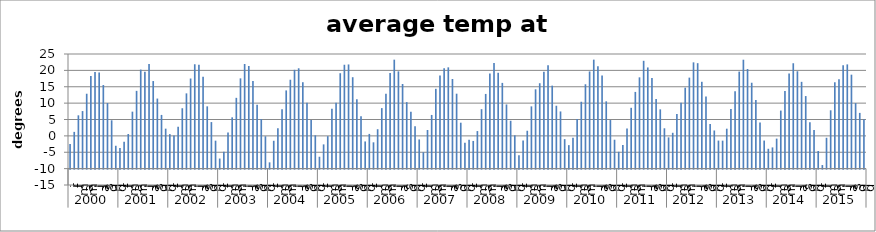
| Category | avg T |
|---|---|
| 0 | -2.5 |
| 1 | 1.222 |
| 2 | 6.278 |
| 3 | 7.576 |
| 4 | 12.867 |
| 5 | 18.313 |
| 6 | 19.541 |
| 7 | 19.361 |
| 8 | 15.525 |
| 9 | 10.04 |
| 10 | 4.756 |
| 11 | -3.018 |
| 12 | -3.688 |
| 13 | -1.783 |
| 14 | 0.572 |
| 15 | 7.396 |
| 16 | 13.746 |
| 17 | 20.231 |
| 18 | 19.61 |
| 19 | 21.93 |
| 20 | 16.744 |
| 21 | 11.394 |
| 22 | 6.401 |
| 23 | 2.203 |
| 24 | 0.542 |
| 25 | 0.091 |
| 26 | 2.758 |
| 27 | 8.437 |
| 28 | 12.981 |
| 29 | 17.514 |
| 30 | 21.87 |
| 31 | 21.748 |
| 32 | 18.038 |
| 33 | 9.015 |
| 34 | 4.213 |
| 35 | -1.461 |
| 36 | -6.916 |
| 37 | -4.881 |
| 38 | 1.021 |
| 39 | 5.662 |
| 40 | 11.616 |
| 41 | 17.56 |
| 42 | 21.952 |
| 43 | 21.338 |
| 44 | 16.763 |
| 45 | 9.521 |
| 46 | 5.112 |
| 47 | -0.12 |
| 48 | -8.086 |
| 49 | -1.494 |
| 50 | 2.306 |
| 51 | 8.167 |
| 52 | 13.882 |
| 53 | 17.143 |
| 54 | 20.169 |
| 55 | 20.641 |
| 56 | 16.384 |
| 57 | 10.078 |
| 58 | 4.861 |
| 59 | 0.165 |
| 60 | -6.374 |
| 61 | -2.598 |
| 62 | -0.086 |
| 63 | 8.309 |
| 64 | 10.122 |
| 65 | 19.134 |
| 66 | 21.721 |
| 67 | 21.81 |
| 68 | 17.913 |
| 69 | 11.147 |
| 70 | 5.984 |
| 71 | -1.7 |
| 72 | 0.599 |
| 73 | -1.969 |
| 74 | 2.035 |
| 75 | 8.48 |
| 76 | 12.894 |
| 77 | 19.228 |
| 78 | 23.27 |
| 79 | 19.705 |
| 80 | 15.837 |
| 81 | 10.31 |
| 82 | 7.361 |
| 83 | 2.973 |
| 84 | -1.093 |
| 85 | -5.003 |
| 86 | 1.792 |
| 87 | 6.39 |
| 88 | 14.371 |
| 89 | 18.415 |
| 90 | 20.627 |
| 91 | 20.927 |
| 92 | 17.373 |
| 93 | 12.881 |
| 94 | 4.022 |
| 95 | -2.082 |
| 96 | -1.152 |
| 97 | -1.547 |
| 98 | 1.471 |
| 99 | 8.154 |
| 100 | 12.806 |
| 101 | 19.057 |
| 102 | 22.261 |
| 103 | 19.265 |
| 104 | 16.18 |
| 105 | 9.595 |
| 106 | 4.614 |
| 107 | 0.166 |
| 108 | -5.934 |
| 109 | -1.419 |
| 110 | 1.564 |
| 111 | 9.01 |
| 112 | 14.22 |
| 113 | 16.075 |
| 114 | 19.592 |
| 115 | 21.559 |
| 116 | 15.34 |
| 117 | 9.204 |
| 118 | 7.458 |
| 119 | -0.999 |
| 120 | -2.826 |
| 121 | -0.601 |
| 122 | 5.159 |
| 123 | 10.418 |
| 124 | 15.759 |
| 125 | 19.676 |
| 126 | 23.279 |
| 127 | 21.242 |
| 128 | 18.439 |
| 129 | 10.551 |
| 130 | 4.837 |
| 131 | -1.174 |
| 132 | -4.858 |
| 133 | -2.795 |
| 134 | 2.227 |
| 135 | 8.569 |
| 136 | 13.423 |
| 137 | 17.872 |
| 138 | 22.926 |
| 139 | 20.892 |
| 140 | 17.656 |
| 141 | 11.292 |
| 142 | 8.1 |
| 143 | 2.319 |
| 144 | -0.46 |
| 145 | 0.943 |
| 146 | 6.676 |
| 147 | 10.138 |
| 148 | 14.718 |
| 149 | 17.788 |
| 150 | 22.452 |
| 151 | 22.2 |
| 152 | 16.513 |
| 153 | 12.011 |
| 154 | 3.612 |
| 155 | 1.65 |
| 156 | -1.439 |
| 157 | -1.455 |
| 158 | 2.194 |
| 159 | 8.178 |
| 160 | 13.627 |
| 161 | 19.626 |
| 162 | 23.254 |
| 163 | 20.408 |
| 164 | 16.224 |
| 165 | 10.942 |
| 166 | 4.058 |
| 167 | -1.424 |
| 168 | -3.943 |
| 169 | -3.521 |
| 170 | -0.835 |
| 171 | 7.725 |
| 172 | 13.682 |
| 173 | 19.059 |
| 174 | 22.178 |
| 175 | 19.74 |
| 176 | 16.5 |
| 177 | 12.156 |
| 178 | 4.138 |
| 179 | 1.782 |
| 180 | -4.625 |
| 181 | -8.907 |
| 182 | -0.58 |
| 183 | 7.807 |
| 184 | 16.37 |
| 185 | 17.272 |
| 186 | 21.54 |
| 187 | 21.828 |
| 188 | 18.688 |
| 189 | 10.017 |
| 190 | 7.017 |
| 191 | 5.057 |